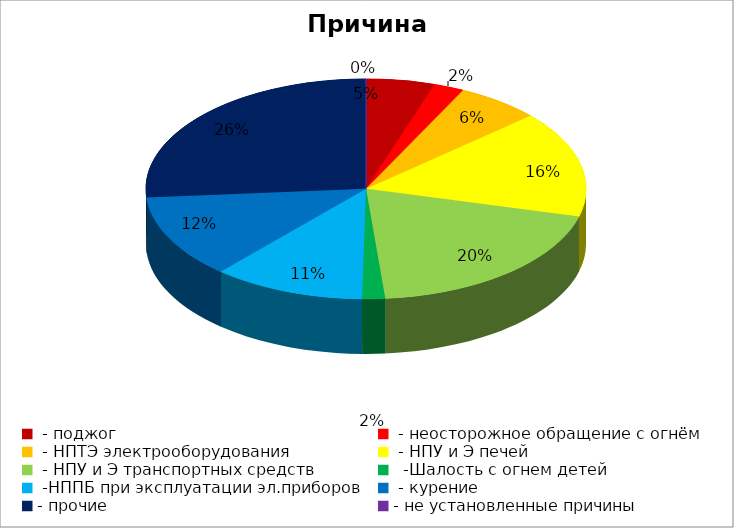
| Category | Причина пожара |
|---|---|
|  - поджог | 9 |
|  - неосторожное обращение с огнём | 4 |
|  - НПТЭ электрооборудования | 11 |
|  - НПУ и Э печей | 28 |
|  - НПУ и Э транспортных средств | 35 |
|   -Шалость с огнем детей | 3 |
|  -НППБ при эксплуатации эл.приборов | 20 |
|  - курение | 22 |
| - прочие | 47 |
| - не установленные причины | 0 |